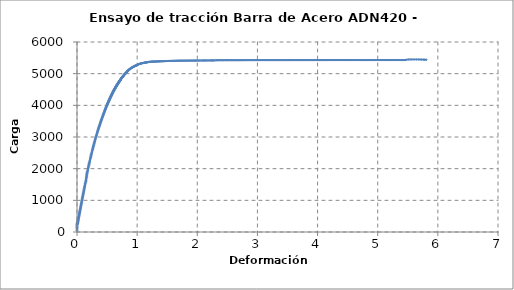
| Category | Series 0 |
|---|---|
| 0.0 | 50.966 |
| 0.0001 | 89.378 |
| 0.0001 | 114.108 |
| 0.0001 | 138.506 |
| 0.0002 | 161.801 |
| 0.0003 | 184.386 |
| 0.0003 | 205.74 |
| 0.0007 | 222.921 |
| 0.0021 | 235.118 |
| 0.004 | 246.118 |
| 0.0054 | 257.587 |
| 0.0067 | 268.246 |
| 0.0074 | 274.103 |
| 0.0075 | 275.576 |
| 0.0075 | 277.417 |
| 0.0081 | 285.252 |
| 0.0096 | 297.065 |
| 0.011 | 307.972 |
| 0.0121 | 318.773 |
| 0.0132 | 328.981 |
| 0.0143 | 338.041 |
| 0.0149 | 344.859 |
| 0.0158 | 352.673 |
| 0.0171 | 364.47 |
| 0.0186 | 378.635 |
| 0.0201 | 393.112 |
| 0.0217 | 408.572 |
| 0.0234 | 425.062 |
| 0.0253 | 442.072 |
| 0.0273 | 459.293 |
| 0.0292 | 477.075 |
| 0.0312 | 495.343 |
| 0.0332 | 513.99 |
| 0.0352 | 533.242 |
| 0.0373 | 552.759 |
| 0.0394 | 572.233 |
| 0.0416 | 593.051 |
| 0.0436 | 614.038 |
| 0.0456 | 634.258 |
| 0.0478 | 655.067 |
| 0.05 | 677.257 |
| 0.0523 | 700.229 |
| 0.0546 | 723.09 |
| 0.057 | 745.448 |
| 0.0593 | 767.745 |
| 0.0616 | 790.885 |
| 0.064 | 815.063 |
| 0.0664 | 839.115 |
| 0.069 | 862.834 |
| 0.0713 | 887.181 |
| 0.0737 | 911.754 |
| 0.0763 | 935.252 |
| 0.0787 | 959.363 |
| 0.0811 | 983.616 |
| 0.0836 | 1007.94 |
| 0.086 | 1032.562 |
| 0.0884 | 1057.904 |
| 0.091 | 1082.968 |
| 0.0936 | 1107.815 |
| 0.0962 | 1132.374 |
| 0.0988 | 1157.466 |
| 0.1014 | 1183.275 |
| 0.1042 | 1209.488 |
| 0.1069 | 1235.47 |
| 0.1095 | 1261.935 |
| 0.112 | 1288.365 |
| 0.1147 | 1315.069 |
| 0.1178 | 1342.714 |
| 0.1205 | 1370.266 |
| 0.1232 | 1398.637 |
| 0.1261 | 1425.845 |
| 0.129 | 1452.718 |
| 0.1319 | 1480.634 |
| 0.1348 | 1508.534 |
| 0.1374 | 1536.274 |
| 0.1414 | 1564.175 |
| 0.1464 | 1591.698 |
| 0.1494 | 1619.041 |
| 0.15 | 1647.502 |
| 0.1518 | 1676.351 |
| 0.1548 | 1705.054 |
| 0.1578 | 1733.33 |
| 0.1596 | 1761.537 |
| 0.1606 | 1789.723 |
| 0.1629 | 1818.264 |
| 0.166 | 1847.184 |
| 0.1693 | 1875.674 |
| 0.1729 | 1903.504 |
| 0.1762 | 1931.692 |
| 0.1794 | 1959.588 |
| 0.1826 | 1987.922 |
| 0.1857 | 2017.195 |
| 0.189 | 2045.96 |
| 0.1923 | 2074.076 |
| 0.1956 | 2102.212 |
| 0.199 | 2130.867 |
| 0.2025 | 2159.273 |
| 0.2059 | 2187.459 |
| 0.2093 | 2216.254 |
| 0.2126 | 2244.654 |
| 0.2161 | 2273.279 |
| 0.2199 | 2302.63 |
| 0.2235 | 2331.542 |
| 0.227 | 2359.99 |
| 0.2306 | 2388.148 |
| 0.2339 | 2415.811 |
| 0.2373 | 2444.703 |
| 0.2408 | 2472.894 |
| 0.2445 | 2500.296 |
| 0.2484 | 2528.073 |
| 0.2521 | 2555.992 |
| 0.2557 | 2583.18 |
| 0.2592 | 2610.573 |
| 0.2628 | 2637.32 |
| 0.2665 | 2663.821 |
| 0.27 | 2690.561 |
| 0.2735 | 2716.606 |
| 0.2772 | 2743.139 |
| 0.2812 | 2770.048 |
| 0.285 | 2796.254 |
| 0.2887 | 2822.792 |
| 0.2924 | 2849.458 |
| 0.2962 | 2875.267 |
| 0.2999 | 2901.227 |
| 0.3036 | 2926.97 |
| 0.3074 | 2952.4 |
| 0.3112 | 2978.12 |
| 0.315 | 3003.006 |
| 0.3189 | 3027.44 |
| 0.3227 | 3051.321 |
| 0.3266 | 3074.978 |
| 0.3306 | 3098.93 |
| 0.3344 | 3123.484 |
| 0.3382 | 3147.858 |
| 0.342 | 3171.87 |
| 0.3459 | 3194.562 |
| 0.3495 | 3216.542 |
| 0.353 | 3239.289 |
| 0.3569 | 3262.376 |
| 0.3608 | 3285.444 |
| 0.3646 | 3307.413 |
| 0.3683 | 3328.749 |
| 0.3721 | 3350.299 |
| 0.3762 | 3371.788 |
| 0.3798 | 3393.612 |
| 0.3835 | 3415.115 |
| 0.3871 | 3435.892 |
| 0.3908 | 3456.778 |
| 0.3945 | 3477.444 |
| 0.3981 | 3498.138 |
| 0.4018 | 3518.391 |
| 0.4056 | 3537.902 |
| 0.4091 | 3557.272 |
| 0.4124 | 3576.485 |
| 0.4159 | 3595.178 |
| 0.4196 | 3613.565 |
| 0.4233 | 3631.643 |
| 0.4268 | 3649.383 |
| 0.4302 | 3667.271 |
| 0.4335 | 3685.218 |
| 0.4367 | 3703.479 |
| 0.4399 | 3721.378 |
| 0.4434 | 3738.74 |
| 0.447 | 3756.396 |
| 0.4505 | 3773.736 |
| 0.4539 | 3790.424 |
| 0.4571 | 3807.059 |
| 0.4604 | 3823.633 |
| 0.4636 | 3840.121 |
| 0.4668 | 3856.128 |
| 0.47 | 3871.322 |
| 0.4731 | 3886.498 |
| 0.4761 | 3902.031 |
| 0.4792 | 3916.944 |
| 0.4822 | 3931.339 |
| 0.4853 | 3945.906 |
| 0.4883 | 3960.504 |
| 0.4914 | 3974.564 |
| 0.4943 | 3988.628 |
| 0.4972 | 4002.279 |
| 0.5001 | 4016.055 |
| 0.5033 | 4029.869 |
| 0.5066 | 4042.479 |
| 0.5097 | 4055.203 |
| 0.5123 | 4068.158 |
| 0.515 | 4080.685 |
| 0.5179 | 4092.974 |
| 0.5208 | 4104.836 |
| 0.5234 | 4116.118 |
| 0.526 | 4127.568 |
| 0.5287 | 4139.213 |
| 0.5314 | 4150.479 |
| 0.5342 | 4161.846 |
| 0.5368 | 4173.132 |
| 0.5395 | 4184.021 |
| 0.5421 | 4195.162 |
| 0.5446 | 4206.12 |
| 0.5471 | 4216.466 |
| 0.5497 | 4226.252 |
| 0.5522 | 4236.44 |
| 0.5547 | 4247.708 |
| 0.5573 | 4258.717 |
| 0.5599 | 4268.71 |
| 0.5625 | 4277.97 |
| 0.5649 | 4287.886 |
| 0.5672 | 4297.862 |
| 0.5696 | 4307.624 |
| 0.572 | 4316.935 |
| 0.5743 | 4325.872 |
| 0.5768 | 4335.286 |
| 0.5792 | 4344.916 |
| 0.5816 | 4353.992 |
| 0.584 | 4363.026 |
| 0.5864 | 4372.127 |
| 0.5886 | 4381.225 |
| 0.5908 | 4390.45 |
| 0.5931 | 4399.42 |
| 0.5954 | 4408.135 |
| 0.5978 | 4416.423 |
| 0.6 | 4424.635 |
| 0.6022 | 4432.864 |
| 0.6044 | 4440.449 |
| 0.6068 | 4448.373 |
| 0.6091 | 4456.983 |
| 0.6114 | 4465.312 |
| 0.6137 | 4473.233 |
| 0.6159 | 4481.233 |
| 0.618 | 4488.969 |
| 0.6202 | 4496.126 |
| 0.6225 | 4503.747 |
| 0.6247 | 4511.278 |
| 0.6269 | 4518.402 |
| 0.6291 | 4525.612 |
| 0.6313 | 4533.714 |
| 0.6334 | 4540.951 |
| 0.6355 | 4547.322 |
| 0.6376 | 4554.693 |
| 0.6398 | 4562.359 |
| 0.6419 | 4569.065 |
| 0.6441 | 4575.574 |
| 0.6462 | 4582.378 |
| 0.6483 | 4588.635 |
| 0.6506 | 4594.771 |
| 0.6525 | 4601.537 |
| 0.6544 | 4608.981 |
| 0.6564 | 4615.471 |
| 0.6584 | 4621.372 |
| 0.6603 | 4627.754 |
| 0.6623 | 4634.067 |
| 0.6643 | 4640.225 |
| 0.6664 | 4646.614 |
| 0.6684 | 4652.873 |
| 0.6704 | 4659.279 |
| 0.6724 | 4665.409 |
| 0.6745 | 4671.515 |
| 0.6763 | 4677.621 |
| 0.6783 | 4683.409 |
| 0.6803 | 4688.871 |
| 0.6821 | 4694.052 |
| 0.6842 | 4699.596 |
| 0.6862 | 4705.583 |
| 0.6881 | 4710.905 |
| 0.6901 | 4715.956 |
| 0.6918 | 4721.845 |
| 0.6935 | 4727.411 |
| 0.6955 | 4732.15 |
| 0.6974 | 4737.109 |
| 0.6993 | 4742.314 |
| 0.7011 | 4747.129 |
| 0.7029 | 4752.787 |
| 0.7051 | 4758.777 |
| 0.707 | 4763.694 |
| 0.7089 | 4768.102 |
| 0.7107 | 4773.136 |
| 0.7126 | 4778.183 |
| 0.7145 | 4782.59 |
| 0.7164 | 4787.09 |
| 0.7181 | 4791.64 |
| 0.7204 | 4799.8 |
| 0.7233 | 4811.923 |
| 0.7264 | 4822.925 |
| 0.7294 | 4830.604 |
| 0.7322 | 4836.788 |
| 0.7348 | 4843.424 |
| 0.7374 | 4850.86 |
| 0.7402 | 4857.902 |
| 0.7432 | 4865.261 |
| 0.746 | 4872.961 |
| 0.7487 | 4880.035 |
| 0.7514 | 4886.158 |
| 0.7539 | 4892.578 |
| 0.7565 | 4899.452 |
| 0.7593 | 4906.47 |
| 0.7623 | 4913.008 |
| 0.7652 | 4919.115 |
| 0.7679 | 4925.89 |
| 0.7706 | 4932.349 |
| 0.7731 | 4938.224 |
| 0.7756 | 4944.216 |
| 0.7783 | 4950.636 |
| 0.7812 | 4956.779 |
| 0.784 | 4962.731 |
| 0.7866 | 4968.838 |
| 0.7894 | 4974.653 |
| 0.792 | 4980.072 |
| 0.7947 | 4985.571 |
| 0.7976 | 4990.834 |
| 0.8004 | 4996.258 |
| 0.8029 | 5002.279 |
| 0.8055 | 5007.519 |
| 0.8083 | 5011.848 |
| 0.8111 | 5016.946 |
| 0.8137 | 5022.615 |
| 0.8161 | 5027.91 |
| 0.8189 | 5032.849 |
| 0.8216 | 5037.793 |
| 0.8243 | 5043.004 |
| 0.827 | 5048.504 |
| 0.8296 | 5053.803 |
| 0.8322 | 5058.142 |
| 0.8349 | 5062.74 |
| 0.8384 | 5073.176 |
| 0.8429 | 5087.088 |
| 0.8474 | 5096.99 |
| 0.8515 | 5103.423 |
| 0.8555 | 5109.139 |
| 0.8594 | 5115.132 |
| 0.8633 | 5121.314 |
| 0.867 | 5127.202 |
| 0.8705 | 5133.102 |
| 0.8744 | 5138.983 |
| 0.8781 | 5144.878 |
| 0.8818 | 5150.602 |
| 0.8859 | 5156.045 |
| 0.89 | 5161.384 |
| 0.894 | 5166.866 |
| 0.898 | 5172.173 |
| 0.9021 | 5176.97 |
| 0.9064 | 5181.746 |
| 0.9105 | 5186.958 |
| 0.9148 | 5192.153 |
| 0.9192 | 5197.658 |
| 0.9234 | 5202.734 |
| 0.9276 | 5207.77 |
| 0.9319 | 5212.895 |
| 0.9362 | 5217.348 |
| 0.9407 | 5221.412 |
| 0.9452 | 5225.832 |
| 0.9498 | 5230.642 |
| 0.9545 | 5235.005 |
| 0.9589 | 5239.122 |
| 0.9633 | 5243.623 |
| 0.9678 | 5248.14 |
| 0.9726 | 5252.023 |
| 0.9772 | 5255.194 |
| 0.9819 | 5258.765 |
| 0.9867 | 5262.912 |
| 0.9916 | 5267.106 |
| 0.9963 | 5271.345 |
| 1.0012 | 5275.104 |
| 1.0068 | 5280.781 |
| 1.0129 | 5287.873 |
| 1.0194 | 5294.238 |
| 1.0261 | 5299.406 |
| 1.0329 | 5303.687 |
| 1.0404 | 5308.914 |
| 1.0481 | 5313.743 |
| 1.0556 | 5316.974 |
| 1.0633 | 5320.953 |
| 1.0713 | 5325.042 |
| 1.0793 | 5328.779 |
| 1.0876 | 5332.094 |
| 1.0962 | 5336.027 |
| 1.105 | 5340.151 |
| 1.1139 | 5343.75 |
| 1.1232 | 5346.614 |
| 1.1324 | 5349.218 |
| 1.1417 | 5352.025 |
| 1.1514 | 5354.509 |
| 1.1616 | 5356.78 |
| 1.1723 | 5359.517 |
| 1.184 | 5366.21 |
| 1.1964 | 5372.284 |
| 1.2074 | 5373.148 |
| 1.2168 | 5373.094 |
| 1.2275 | 5375.877 |
| 1.24 | 5379.786 |
| 1.2526 | 5381.482 |
| 1.264 | 5381.658 |
| 1.2746 | 5381.635 |
| 1.2855 | 5381.653 |
| 1.2965 | 5381.992 |
| 1.3076 | 5382.315 |
| 1.3187 | 5383.792 |
| 1.33 | 5386.011 |
| 1.3417 | 5387.295 |
| 1.3535 | 5388.279 |
| 1.3653 | 5389.262 |
| 1.3775 | 5390.483 |
| 1.39 | 5391.697 |
| 1.4027 | 5392.706 |
| 1.4156 | 5393.335 |
| 1.4287 | 5394.182 |
| 1.4419 | 5395.531 |
| 1.4557 | 5396.618 |
| 1.4699 | 5397.421 |
| 1.4836 | 5398.368 |
| 1.4975 | 5399.297 |
| 1.5121 | 5400.174 |
| 1.5273 | 5400.912 |
| 1.543 | 5401.52 |
| 1.5587 | 5402.603 |
| 1.5742 | 5403.749 |
| 1.5896 | 5404.278 |
| 1.6049 | 5404.961 |
| 1.6207 | 5405.638 |
| 1.6366 | 5406.138 |
| 1.6527 | 5406.744 |
| 1.6689 | 5407.543 |
| 1.6844 | 5408.478 |
| 1.7002 | 5409.341 |
| 1.7165 | 5409.891 |
| 1.7328 | 5410.223 |
| 1.749 | 5410.162 |
| 1.7653 | 5410.34 |
| 1.7819 | 5410.833 |
| 1.7987 | 5411.376 |
| 1.8155 | 5411.772 |
| 1.8321 | 5412.082 |
| 1.849 | 5412.411 |
| 1.866 | 5412.821 |
| 1.8832 | 5413.132 |
| 1.9001 | 5413.282 |
| 1.9172 | 5413.31 |
| 1.935 | 5413.51 |
| 1.953 | 5413.835 |
| 1.971 | 5414.213 |
| 1.9893 | 5414.522 |
| 2.0075 | 5414.934 |
| 2.0253 | 5415.144 |
| 2.0436 | 5415.432 |
| 2.0627 | 5415.808 |
| 2.0819 | 5416.106 |
| 2.1011 | 5416.665 |
| 2.1202 | 5416.864 |
| 2.1394 | 5417.016 |
| 2.1586 | 5417.33 |
| 2.1779 | 5417.588 |
| 2.1972 | 5417.738 |
| 2.2161 | 5417.839 |
| 2.2348 | 5418.019 |
| 2.2534 | 5418.236 |
| 2.2722 | 5418.578 |
| 2.2916 | 5420.066 |
| 2.312 | 5422.59 |
| 2.3323 | 5424.412 |
| 2.3525 | 5424.637 |
| 2.3734 | 5424.76 |
| 2.3947 | 5424.957 |
| 2.4164 | 5425.028 |
| 2.4384 | 5425.068 |
| 2.4607 | 5425.228 |
| 2.4829 | 5425.401 |
| 2.5048 | 5425.371 |
| 2.5268 | 5425.438 |
| 2.5489 | 5425.422 |
| 2.5712 | 5425.483 |
| 2.5931 | 5425.528 |
| 2.615 | 5425.488 |
| 2.6368 | 5425.737 |
| 2.6587 | 5426.222 |
| 2.681 | 5425.873 |
| 2.7035 | 5425.573 |
| 2.7258 | 5426.058 |
| 2.7481 | 5426.29 |
| 2.7707 | 5426.654 |
| 2.7932 | 5426.999 |
| 2.8156 | 5427.119 |
| 2.8379 | 5427.102 |
| 2.8604 | 5427.31 |
| 2.8834 | 5427.498 |
| 2.9068 | 5427.602 |
| 2.9302 | 5427.811 |
| 2.9531 | 5428.053 |
| 2.9761 | 5428.042 |
| 2.9986 | 5427.929 |
| 3.0214 | 5428.112 |
| 3.0436 | 5428.328 |
| 3.0659 | 5428.403 |
| 3.0886 | 5428.377 |
| 3.1114 | 5428.577 |
| 3.1342 | 5428.679 |
| 3.157 | 5428.629 |
| 3.1798 | 5428.49 |
| 3.2022 | 5428.493 |
| 3.2245 | 5428.507 |
| 3.2475 | 5428.301 |
| 3.2706 | 5428.108 |
| 3.2937 | 5428.135 |
| 3.3168 | 5428.113 |
| 3.3394 | 5428.268 |
| 3.3619 | 5428.485 |
| 3.385 | 5428.567 |
| 3.408 | 5428.482 |
| 3.4309 | 5428.313 |
| 3.4541 | 5428.484 |
| 3.4771 | 5428.65 |
| 3.5001 | 5428.542 |
| 3.5229 | 5428.409 |
| 3.5457 | 5428.487 |
| 3.5684 | 5428.733 |
| 3.5911 | 5428.827 |
| 3.6133 | 5428.662 |
| 3.6355 | 5428.768 |
| 3.6581 | 5428.727 |
| 3.6807 | 5428.618 |
| 3.7031 | 5428.647 |
| 3.7253 | 5428.979 |
| 3.7474 | 5429.198 |
| 3.7696 | 5429.089 |
| 3.7917 | 5428.664 |
| 3.8136 | 5428.813 |
| 3.8356 | 5429.247 |
| 3.8576 | 5429.3 |
| 3.8798 | 5429.057 |
| 3.902 | 5429.11 |
| 3.9239 | 5429.208 |
| 3.9453 | 5429.135 |
| 3.9666 | 5429.177 |
| 3.988 | 5429.389 |
| 4.0093 | 5429.292 |
| 4.0299 | 5428.946 |
| 4.0504 | 5429.217 |
| 4.0713 | 5429.309 |
| 4.0923 | 5429.379 |
| 4.1127 | 5429.447 |
| 4.1328 | 5429.687 |
| 4.1535 | 5429.909 |
| 4.1744 | 5429.847 |
| 4.1953 | 5429.951 |
| 4.2163 | 5429.964 |
| 4.2373 | 5429.994 |
| 4.2583 | 5429.993 |
| 4.2791 | 5430.104 |
| 4.2998 | 5430.278 |
| 4.3207 | 5430.125 |
| 4.3418 | 5430.12 |
| 4.363 | 5430.145 |
| 4.3843 | 5430.146 |
| 4.4058 | 5430.039 |
| 4.4272 | 5430.152 |
| 4.4484 | 5429.923 |
| 4.4695 | 5429.898 |
| 4.4906 | 5430.075 |
| 4.5119 | 5429.996 |
| 4.5333 | 5429.953 |
| 4.5547 | 5430.167 |
| 4.5755 | 5430.345 |
| 4.596 | 5430.343 |
| 4.6169 | 5430.235 |
| 4.6378 | 5430.298 |
| 4.6586 | 5430.18 |
| 4.6795 | 5430.183 |
| 4.6996 | 5429.973 |
| 4.7193 | 5429.616 |
| 4.7394 | 5429.665 |
| 4.7598 | 5429.817 |
| 4.78 | 5429.739 |
| 4.8002 | 5429.789 |
| 4.8203 | 5430.033 |
| 4.8404 | 5429.921 |
| 4.8605 | 5429.76 |
| 4.8801 | 5429.888 |
| 4.9 | 5430.091 |
| 4.9199 | 5430.062 |
| 4.9395 | 5430.225 |
| 4.9592 | 5430.523 |
| 4.9784 | 5430.719 |
| 4.9976 | 5430.567 |
| 5.0169 | 5430.386 |
| 5.0362 | 5430.452 |
| 5.0559 | 5430.62 |
| 5.0755 | 5430.504 |
| 5.0948 | 5430.482 |
| 5.1144 | 5430.496 |
| 5.1342 | 5430.532 |
| 5.1539 | 5430.416 |
| 5.1739 | 5430.482 |
| 5.1937 | 5430.463 |
| 5.2134 | 5430.521 |
| 5.2335 | 5430.382 |
| 5.2536 | 5430.372 |
| 5.2732 | 5430.411 |
| 5.2921 | 5430.434 |
| 5.311 | 5430.603 |
| 5.33 | 5430.656 |
| 5.3485 | 5430.463 |
| 5.3663 | 5430.428 |
| 5.3837 | 5430.485 |
| 5.401 | 5430.519 |
| 5.4181 | 5430.41 |
| 5.4349 | 5429.921 |
| 5.452 | 5430.176 |
| 5.4747 | 5438.377 |
| 5.5049 | 5447.215 |
| 5.5368 | 5448.727 |
| 5.5689 | 5448.576 |
| 5.6033 | 5448.813 |
| 5.639 | 5448.71 |
| 5.673 | 5448.45 |
| 5.7038 | 5447.168 |
| 5.7321 | 5445.23 |
| 5.7578 | 5443.622 |
| 5.782 | 5441.542 |
| 5.8062 | 5438.599 |